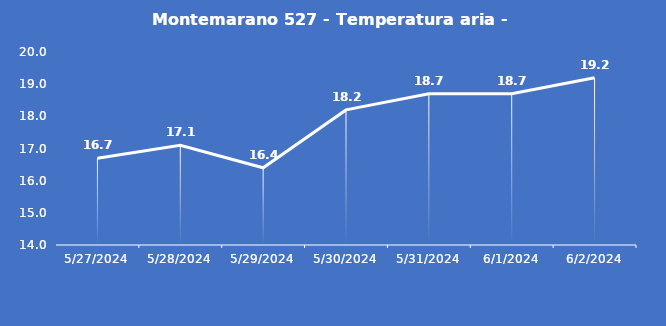
| Category | Montemarano 527 - Temperatura aria - Grezzo (°C) |
|---|---|
| 5/27/24 | 16.7 |
| 5/28/24 | 17.1 |
| 5/29/24 | 16.4 |
| 5/30/24 | 18.2 |
| 5/31/24 | 18.7 |
| 6/1/24 | 18.7 |
| 6/2/24 | 19.2 |